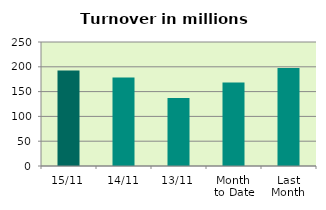
| Category | Series 0 |
|---|---|
| 15/11 | 192.622 |
| 14/11 | 178.515 |
| 13/11 | 137.166 |
| Month 
to Date | 168.246 |
| Last
Month | 197.652 |